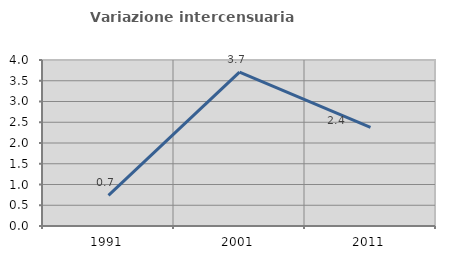
| Category | Variazione intercensuaria annua |
|---|---|
| 1991.0 | 0.74 |
| 2001.0 | 3.71 |
| 2011.0 | 2.379 |